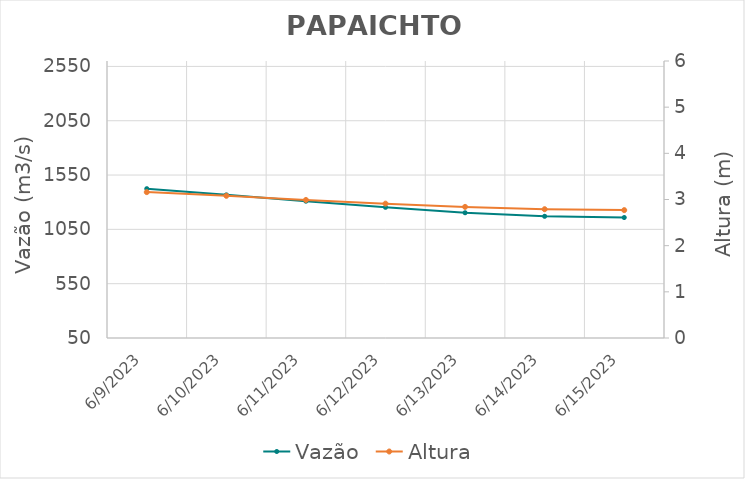
| Category | Vazão |
|---|---|
| 4/26/22 | 2520 |
| 4/25/22 | 2444.07 |
| 4/24/22 | 2357.18 |
| 4/23/22 | 2261.72 |
| 4/22/22 | 2173.01 |
| 4/21/22 | 2087.87 |
| 4/20/22 | 2103.22 |